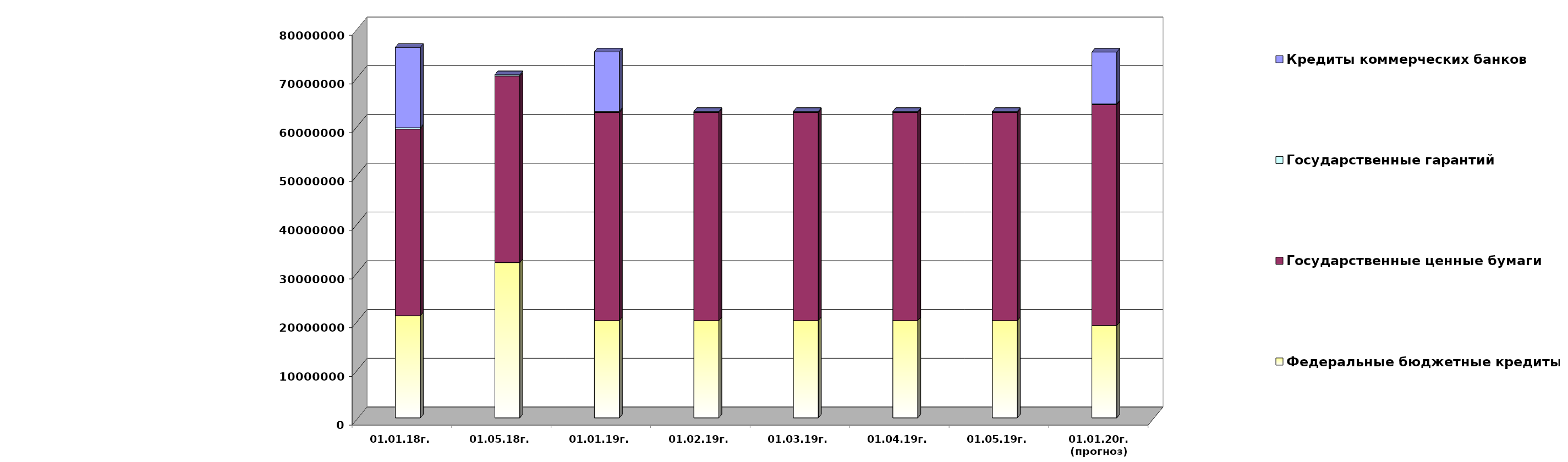
| Category | Федеральные бюджетные кредиты | Государственные ценные бумаги  | Государственные гарантий | Кредиты коммерческих банков |
|---|---|---|---|---|
| 01.01.18г. | 20959084.963 | 38300000 | 267412.82 | 16500000 |
| 01.05.18г. | 31846902.963 | 38300000 | 253223.16 | 0 |
| 01.01.19г. | 19957026.213 | 42700000 | 209872.86 | 12219963.75 |
| 01.02.19г. | 19957026.213 | 42700000 | 200735.86 | 0 |
| 01.03.19г. | 19957026.213 | 42700000 | 200735.86 | 0 |
| 01.04.19г. | 19957026.213 | 42700000 | 200735.86 | 0 |
| 01.05.19г. | 19957026.213 | 42700000 | 200735.86 | 0 |
| 01.01.20г.
(прогноз) | 18954967.4 | 45300000 | 155130 | 10650535.9 |